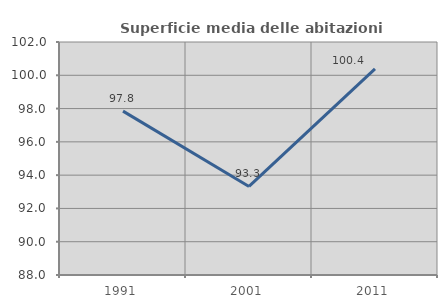
| Category | Superficie media delle abitazioni occupate |
|---|---|
| 1991.0 | 97.848 |
| 2001.0 | 93.32 |
| 2011.0 | 100.386 |